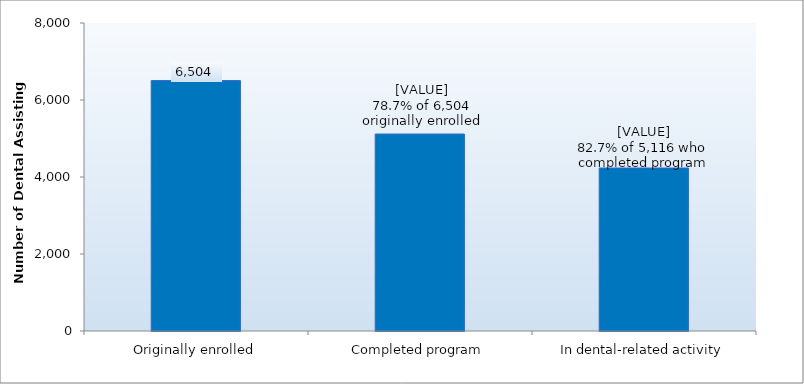
| Category | Series 0 |
|---|---|
| Originally enrolled | 6504 |
| Completed program | 5116 |
| In dental-related activity | 4233 |